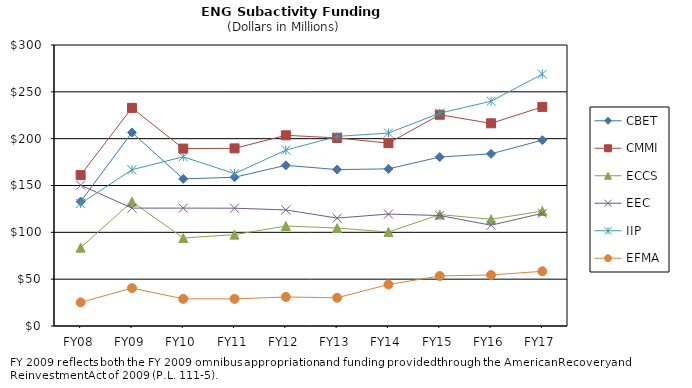
| Category | CBET | CMMI | ECCS | EEC | IIP | EFMA |
|---|---|---|---|---|---|---|
| FY08 | 132.81 | 161.11 | 83.6 | 150.41 | 130.72 | 25.23 |
| FY09 | 206.57 | 232.89 | 132.78 | 125.86 | 166.82 | 40.5 |
| FY10 | 157.08 | 189.4 | 93.97 | 125.86 | 180.63 | 28.99 |
| FY11 | 158.82 | 189.62 | 97.54 | 125.76 | 162.65 | 28.95 |
| FY12 | 171.51 | 203.59 | 106.74 | 123.93 | 187.79 | 30.99 |
| FY13 | 167.014 | 200.807 | 104.584 | 115.208 | 202.408 | 30.156 |
| FY14 | 167.764 | 195.232 | 100.367 | 119.496 | 205.992 | 44.274 |
| FY15 | 180.4 | 225.55 | 118.97 | 117.95 | 227.26 | 53.41 |
| FY16 | 183.82 | 216.39 | 113.95 | 107.61 | 239.93 | 54.49 |
| FY17 | 198.42 | 233.92 | 122.76 | 120.32 | 268.91 | 58.4 |